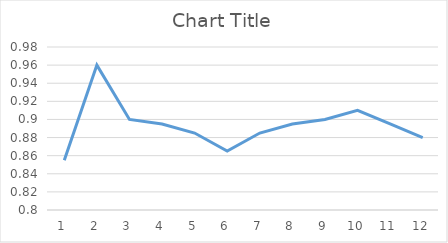
| Category | Series 0 |
|---|---|
| 0 | 0.855 |
| 1 | 0.96 |
| 2 | 0.9 |
| 3 | 0.895 |
| 4 | 0.885 |
| 5 | 0.865 |
| 6 | 0.885 |
| 7 | 0.895 |
| 8 | 0.9 |
| 9 | 0.91 |
| 10 | 0.895 |
| 11 | 0.88 |